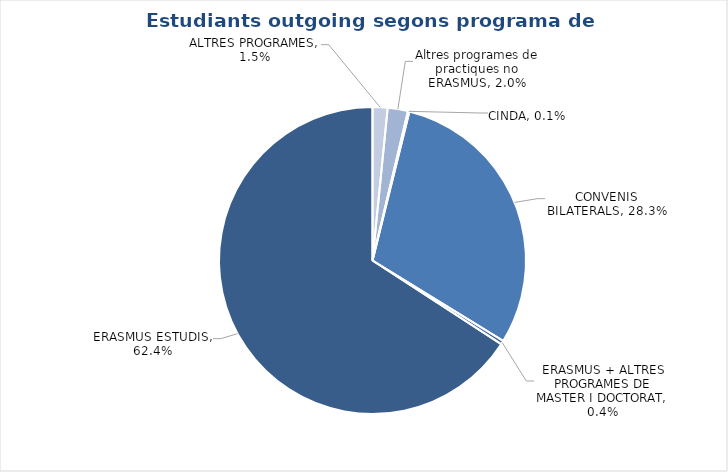
| Category | Estudiants outgoing segons programa de mobilitat |
|---|---|
| ALTRES PROGRAMES | 0.015 |
| Altres programes de practiques no ERASMUS | 0.02 |
| CINDA | 0.001 |
| CONVENIS BILATERALS | 0.283 |
| ERASMUS + ALTRES PROGRAMES DE MASTER I DOCTORAT | 0.004 |
| ERASMUS ESTUDIS | 0.624 |